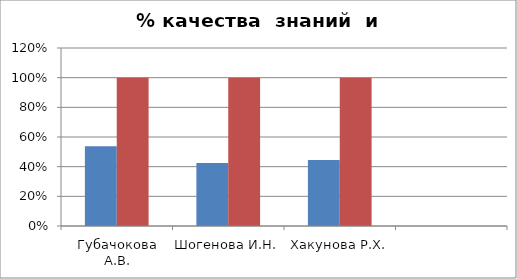
| Category | Series 0 | 2 |
|---|---|---|
| Губачокова А.В. | 0.538 | 1 |
| Шогенова И.Н. | 0.424 | 1 |
| Хакунова Р.Х. | 0.444 | 1 |